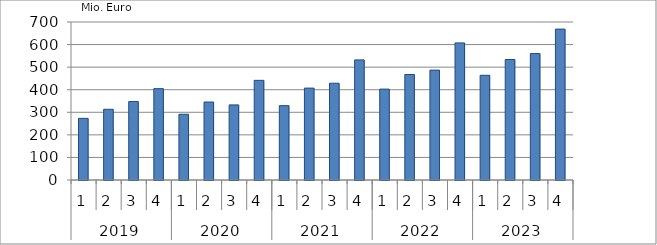
| Category | Ausbaugewerblicher Umsatz3 |
|---|---|
| 0 | 273159.137 |
| 1 | 313254.251 |
| 2 | 347631.281 |
| 3 | 404721.054 |
| 4 | 291272.144 |
| 5 | 345494.215 |
| 6 | 332629.265 |
| 7 | 441463.36 |
| 8 | 329380.212 |
| 9 | 407164.972 |
| 10 | 428783.222 |
| 11 | 532137.089 |
| 12 | 402625.565 |
| 13 | 467398.849 |
| 14 | 486819.26 |
| 15 | 607390.303 |
| 16 | 463895.067 |
| 17 | 533766.53 |
| 18 | 560194.5 |
| 19 | 668571.293 |